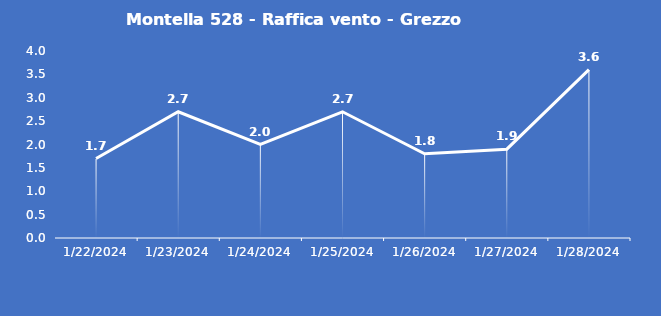
| Category | Montella 528 - Raffica vento - Grezzo (m/s) |
|---|---|
| 1/22/24 | 1.7 |
| 1/23/24 | 2.7 |
| 1/24/24 | 2 |
| 1/25/24 | 2.7 |
| 1/26/24 | 1.8 |
| 1/27/24 | 1.9 |
| 1/28/24 | 3.6 |